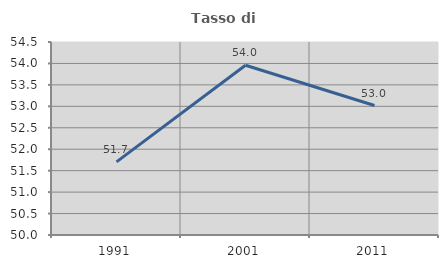
| Category | Tasso di occupazione   |
|---|---|
| 1991.0 | 51.704 |
| 2001.0 | 53.957 |
| 2011.0 | 53.018 |